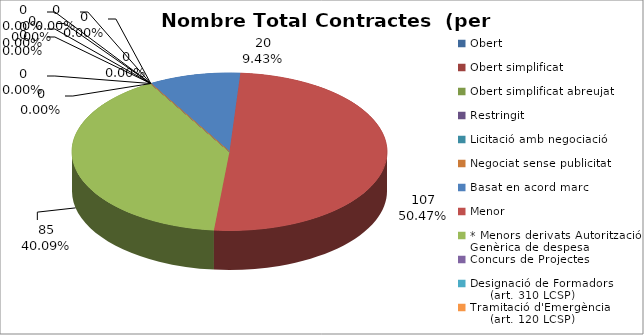
| Category | Nombre Total Contractes |
|---|---|
| Obert | 0 |
| Obert simplificat | 0 |
| Obert simplificat abreujat | 0 |
| Restringit | 0 |
| Licitació amb negociació | 0 |
| Negociat sense publicitat | 0 |
| Basat en acord marc | 20 |
| Menor | 107 |
| * Menors derivats Autorització Genèrica de despesa | 85 |
| Concurs de Projectes | 0 |
| Designació de Formadors
     (art. 310 LCSP) | 0 |
| Tramitació d'Emergència
     (art. 120 LCSP) | 0 |